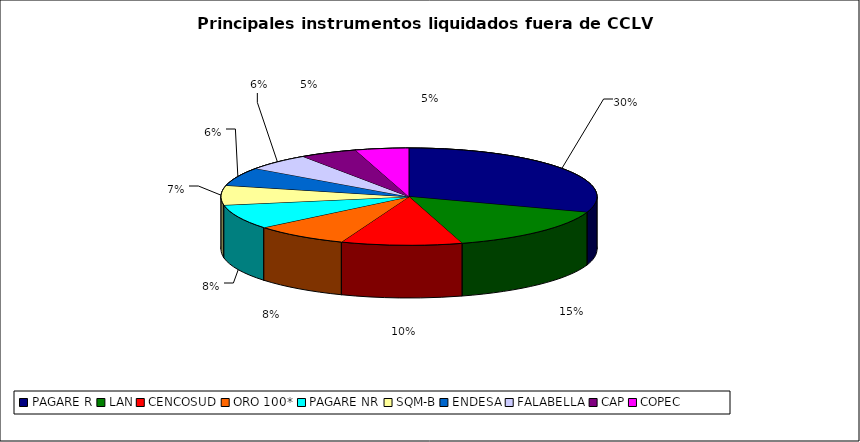
| Category | Series 0 |
|---|---|
| PAGARE R | 2152 |
| LAN | 1083 |
| CENCOSUD | 740 |
| ORO 100* | 583 |
| PAGARE NR | 582 |
| SQM-B | 463 |
| ENDESA | 436 |
| FALABELLA | 400 |
| CAP | 350 |
| COPEC | 328 |